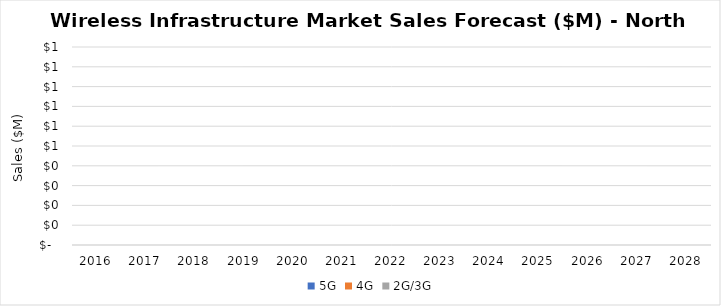
| Category | 5G | 4G | 2G/3G |
|---|---|---|---|
| 2016.0 | 0 | 0 | 0 |
| 2017.0 | 0 | 0 | 0 |
| 2018.0 | 0 | 0 | 0 |
| 2019.0 | 0 | 0 | 0 |
| 2020.0 | 0 | 0 | 0 |
| 2021.0 | 0 | 0 | 0 |
| 2022.0 | 0 | 0 | 0 |
| 2023.0 | 0 | 0 | 0 |
| 2024.0 | 0 | 0 | 0 |
| 2025.0 | 0 | 0 | 0 |
| 2026.0 | 0 | 0 | 0 |
| 2027.0 | 0 | 0 | 0 |
| 2028.0 | 0 | 0 | 0 |